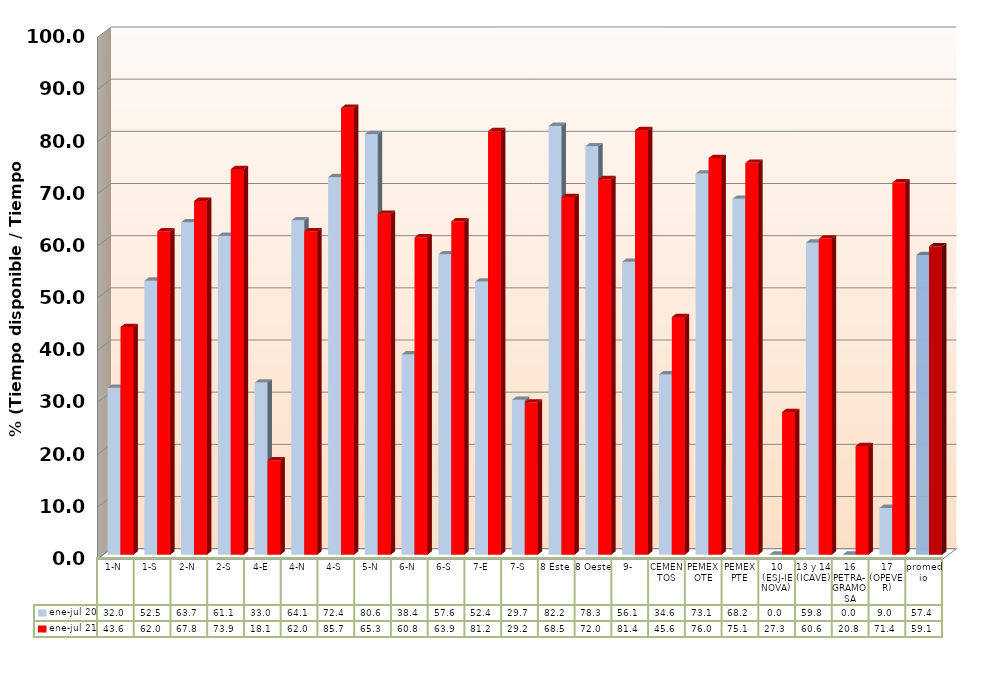
| Category | ene-jul 20 | ene-jul 21 |
|---|---|---|
| 1-N | 32 | 43.646 |
| 1-S | 52.514 | 61.997 |
| 2-N | 63.724 | 67.803 |
| 2-S | 61.126 | 73.912 |
| 4-E | 32.983 | 18.085 |
| 4-N | 64.09 | 61.975 |
| 4-S | 72.364 | 85.653 |
| 5-N | 80.61 | 65.339 |
| 6-N | 38.392 | 60.831 |
| 6-S | 57.568 | 63.908 |
| 7-E | 52.35 | 81.176 |
| 7-S | 29.674 | 29.17 |
| 8 Este | 82.177 | 68.539 |
| 8 Oeste | 78.292 | 71.982 |
| 9- | 56.139 | 81.381 |
| CEMENTOS | 34.558 | 45.56 |
| PEMEX OTE | 73.067 | 76.021 |
| PEMEX PTE | 68.203 | 75.115 |
| 10 (ESJ-IENOVA) | 0 | 27.346 |
| 13 y 14 (ICAVE) | 59.811 | 60.588 |
| 16 PETRA-GRAMOSA | 0 | 20.828 |
| 17 (OPEVER) | 8.953 | 71.352 |
| promedio | 57.414 | 59.096 |